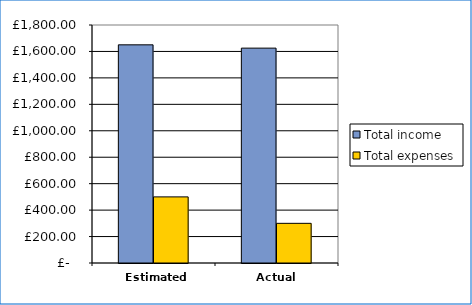
| Category |  Total income  |  Total expenses  |
|---|---|---|
|  Estimated  | 1650 | 500 |
|  Actual  | 1625 | 300 |